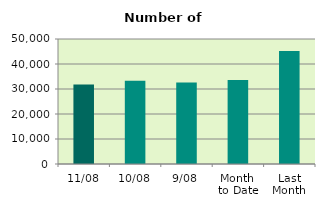
| Category | Series 0 |
|---|---|
| 11/08 | 31806 |
| 10/08 | 33278 |
| 9/08 | 32642 |
| Month 
to Date | 33611.778 |
| Last
Month | 45220.286 |